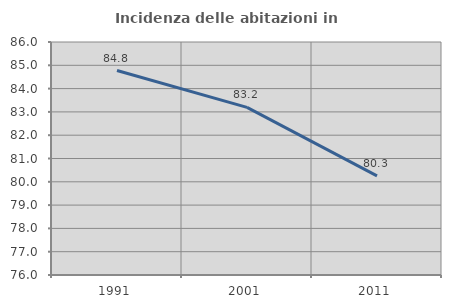
| Category | Incidenza delle abitazioni in proprietà  |
|---|---|
| 1991.0 | 84.775 |
| 2001.0 | 83.194 |
| 2011.0 | 80.251 |